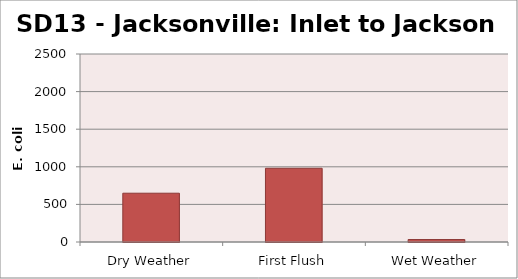
| Category | E. coli MPN |
|---|---|
| Dry Weather | 648.8 |
| First Flush | 980.4 |
| Wet Weather | 32.7 |